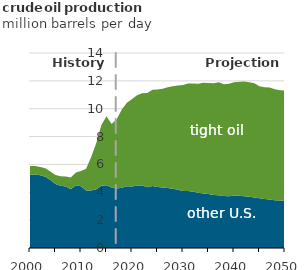
| Category | non-tight oil | tight oil |
|---|---|---|
| 2000.0 | 5.259 | 0.635 |
| 2001.0 | 5.269 | 0.617 |
| 2002.0 | 5.215 | 0.608 |
| 2003.0 | 5.114 | 0.61 |
| 2004.0 | 4.874 | 0.623 |
| 2005.0 | 4.592 | 0.658 |
| 2006.0 | 4.47 | 0.68 |
| 2007.0 | 4.409 | 0.731 |
| 2008.0 | 4.225 | 0.837 |
| 2009.0 | 4.5 | 0.914 |
| 2010.0 | 4.428 | 1.105 |
| 2011.0 | 4.134 | 1.563 |
| 2012.0 | 4.122 | 2.42 |
| 2013.0 | 4.222 | 3.309 |
| 2014.0 | 4.464 | 4.364 |
| 2015.0 | 4.504 | 4.961 |
| 2016.0 | 4.341 | 4.563 |
| 2017.0 | 4.274 | 4.968 |
| 2018.0 | 4.327 | 5.619 |
| 2019.0 | 4.434 | 6.003 |
| 2020.0 | 4.416 | 6.287 |
| 2021.0 | 4.49 | 6.485 |
| 2022.0 | 4.486 | 6.624 |
| 2023.0 | 4.357 | 6.777 |
| 2024.0 | 4.452 | 6.904 |
| 2025.0 | 4.371 | 7.01 |
| 2026.0 | 4.339 | 7.104 |
| 2027.0 | 4.3 | 7.246 |
| 2028.0 | 4.247 | 7.363 |
| 2029.0 | 4.181 | 7.485 |
| 2030.0 | 4.09 | 7.606 |
| 2031.0 | 4.09 | 7.724 |
| 2032.0 | 4.033 | 7.781 |
| 2033.0 | 3.973 | 7.821 |
| 2034.0 | 3.921 | 7.95 |
| 2035.0 | 3.872 | 7.979 |
| 2036.0 | 3.805 | 8.02 |
| 2037.0 | 3.782 | 8.12 |
| 2038.0 | 3.733 | 8.032 |
| 2039.0 | 3.723 | 8.078 |
| 2040.0 | 3.754 | 8.145 |
| 2041.0 | 3.755 | 8.184 |
| 2042.0 | 3.715 | 8.231 |
| 2043.0 | 3.678 | 8.231 |
| 2044.0 | 3.625 | 8.201 |
| 2045.0 | 3.568 | 8.047 |
| 2046.0 | 3.512 | 8.027 |
| 2047.0 | 3.488 | 8.038 |
| 2048.0 | 3.431 | 7.968 |
| 2049.0 | 3.414 | 7.919 |
| 2050.0 | 3.377 | 7.924 |